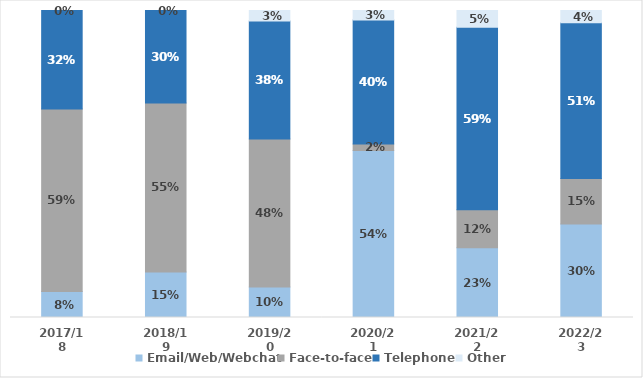
| Category | Email/Web/Webchat | Face-to-face | Telephone | Other |
|---|---|---|---|---|
| 2017/18 | 0.085 | 0.594 | 0.321 | 0 |
| 2018/19 | 0.148 | 0.551 | 0.301 | 0 |
| 2019/20 | 0.099 | 0.482 | 0.384 | 0.034 |
| 2020/21 | 0.544 | 0.021 | 0.404 | 0.031 |
| 2021/22 | 0.227 | 0.124 | 0.595 | 0.055 |
| 2022/23 | 0.304 | 0.149 | 0.507 | 0.04 |